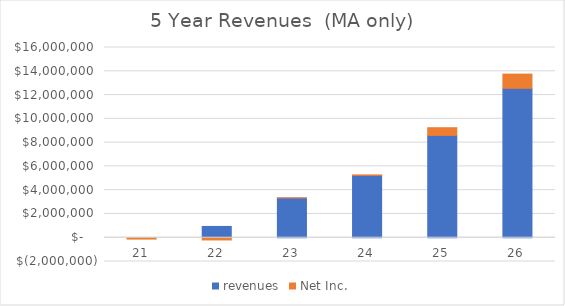
| Category | revenues | Net Inc. |
|---|---|---|
| 21.0 | 0 | -113200 |
| 22.0 | 949000 | -187946.667 |
| 23.0 | 3340566.667 | 1810.667 |
| 24.0 | 5238620.833 | 45191.833 |
| 25.0 | 8607029.167 | 646062.167 |
| 26.0 | 12565366.667 | 1196531.667 |